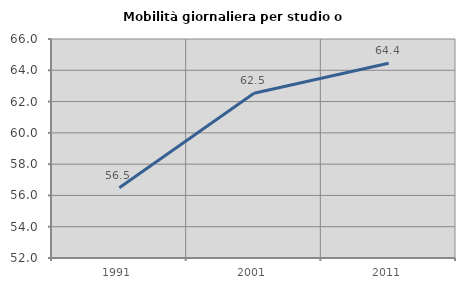
| Category | Mobilità giornaliera per studio o lavoro |
|---|---|
| 1991.0 | 56.486 |
| 2001.0 | 62.533 |
| 2011.0 | 64.444 |